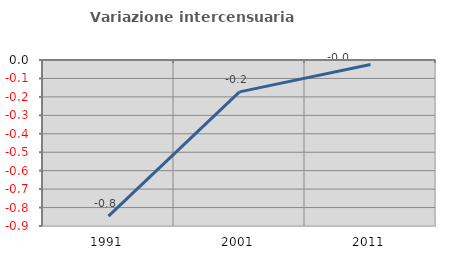
| Category | Variazione intercensuaria annua |
|---|---|
| 1991.0 | -0.846 |
| 2001.0 | -0.173 |
| 2011.0 | -0.024 |